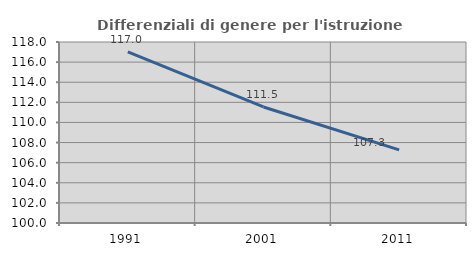
| Category | Differenziali di genere per l'istruzione superiore |
|---|---|
| 1991.0 | 117.026 |
| 2001.0 | 111.539 |
| 2011.0 | 107.277 |